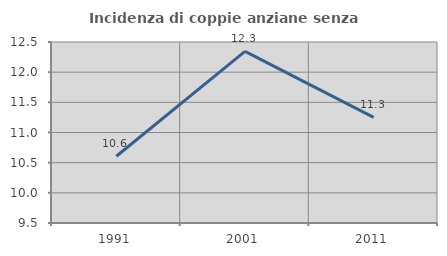
| Category | Incidenza di coppie anziane senza figli  |
|---|---|
| 1991.0 | 10.606 |
| 2001.0 | 12.346 |
| 2011.0 | 11.25 |